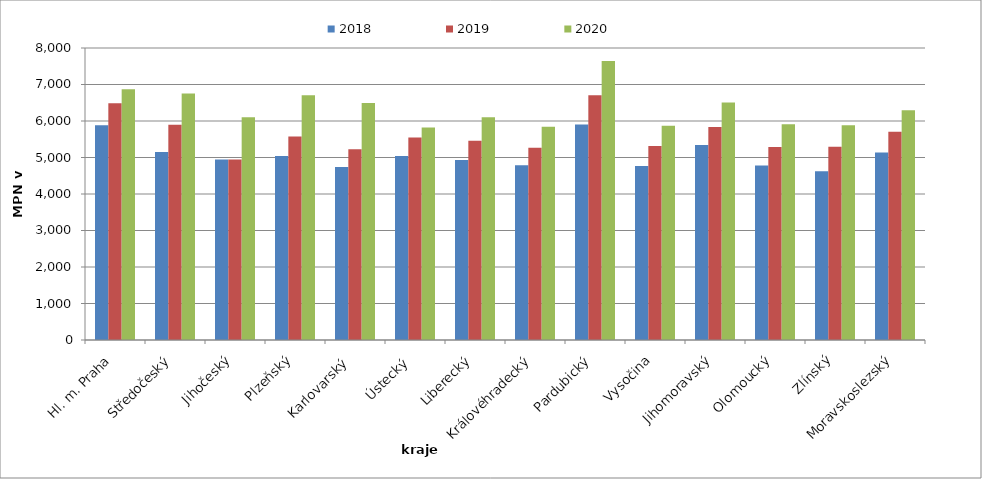
| Category | 2018 | 2019 | 2020 |
|---|---|---|---|
| Hl. m. Praha | 5886 | 6489 | 6871 |
| Středočeský | 5153 | 5898 | 6756 |
| Jihočeský | 4943 | 4943 | 6100 |
| Plzeňský | 5038 | 5576 | 6707 |
| Karlovarský  | 4740 | 5229 | 6493 |
| Ústecký   | 5043 | 5548 | 5819 |
| Liberecký | 4933 | 5456 | 6100 |
| Královéhradecký | 4786 | 5264 | 5843 |
| Pardubický | 5905 | 6705 | 7643 |
| Vysočina | 4769 | 5318 | 5867 |
| Jihomoravský | 5345 | 5837 | 6509 |
| Olomoucký | 4782 | 5285 | 5909 |
| Zlínský | 4624 | 5292 | 5884 |
| Moravskoslezský | 5138 | 5705 | 6296 |